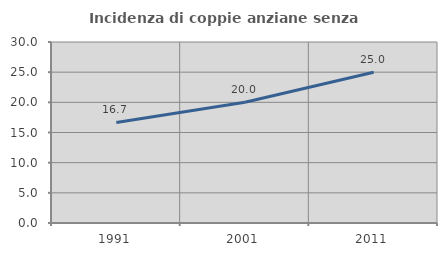
| Category | Incidenza di coppie anziane senza figli  |
|---|---|
| 1991.0 | 16.667 |
| 2001.0 | 20 |
| 2011.0 | 25 |